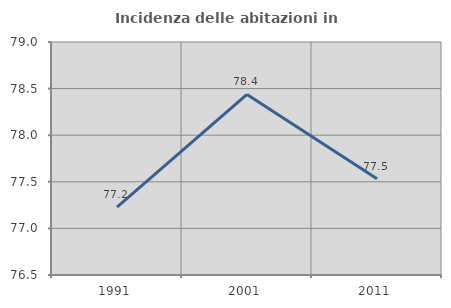
| Category | Incidenza delle abitazioni in proprietà  |
|---|---|
| 1991.0 | 77.228 |
| 2001.0 | 78.438 |
| 2011.0 | 77.533 |